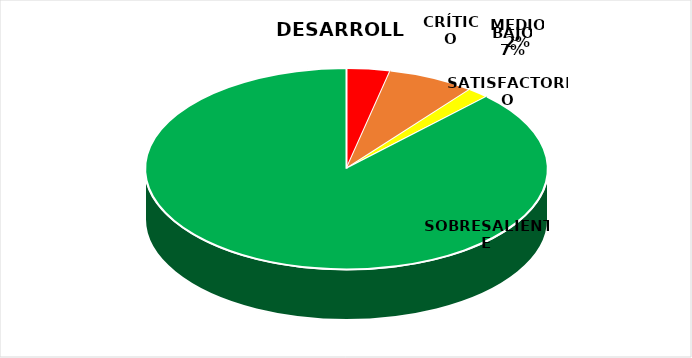
| Category | Series 2 | Series 1 | Series 0 |
|---|---|---|---|
| CRÍTICO | 2 | 0 | 2 |
| BAJO | 4 | 2 | 4 |
| MEDIO | 1 | 3 | 1 |
| SATISFACTORIO | 0 | 7 | 0 |
| SOBRESALIENTE | 50 | 11 | 50 |